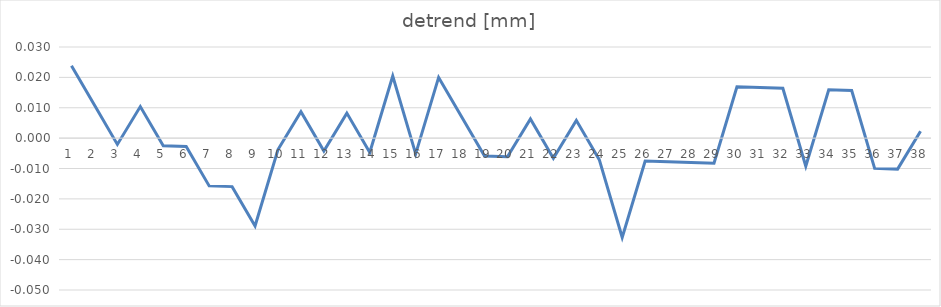
| Category | detrend [mm] |
|---|---|
| 0 | 0.024 |
| 1 | 0.011 |
| 2 | -0.002 |
| 3 | 0.01 |
| 4 | -0.003 |
| 5 | -0.003 |
| 6 | -0.016 |
| 7 | -0.016 |
| 8 | -0.029 |
| 9 | -0.004 |
| 10 | 0.009 |
| 11 | -0.004 |
| 12 | 0.008 |
| 13 | -0.005 |
| 14 | 0.02 |
| 15 | -0.005 |
| 16 | 0.02 |
| 17 | 0.007 |
| 18 | -0.006 |
| 19 | -0.006 |
| 20 | 0.006 |
| 21 | -0.007 |
| 22 | 0.006 |
| 23 | -0.007 |
| 24 | -0.033 |
| 25 | -0.008 |
| 26 | -0.008 |
| 27 | -0.008 |
| 28 | -0.008 |
| 29 | 0.017 |
| 30 | 0.017 |
| 31 | 0.016 |
| 32 | -0.009 |
| 33 | 0.016 |
| 34 | 0.016 |
| 35 | -0.01 |
| 36 | -0.01 |
| 37 | 0.002 |